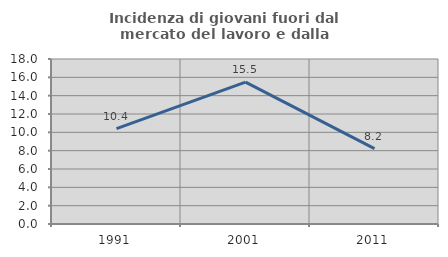
| Category | Incidenza di giovani fuori dal mercato del lavoro e dalla formazione  |
|---|---|
| 1991.0 | 10.403 |
| 2001.0 | 15.482 |
| 2011.0 | 8.219 |